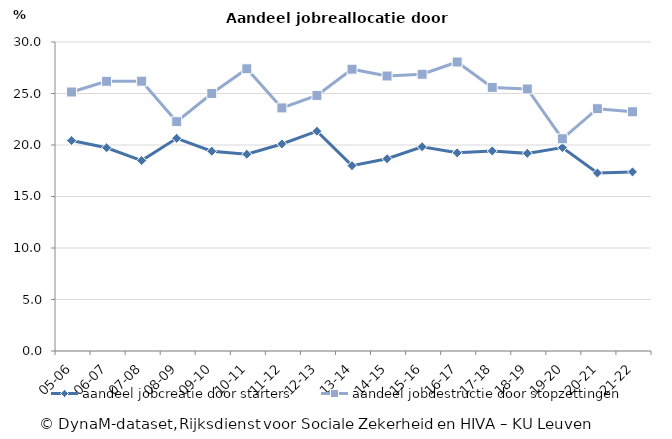
| Category | aandeel jobcreatie door starters | aandeel jobdestructie door stopzettingen |
|---|---|---|
| 21-22 | 17.386 | 23.225 |
| 20-21 | 17.282 | 23.523 |
| 19-20 | 19.747 | 20.603 |
| 18-19 | 19.188 | 25.437 |
| 17-18 | 19.421 | 25.59 |
| 16-17 | 19.239 | 28.058 |
| 15-16 | 19.834 | 26.869 |
| 14-15 | 18.664 | 26.698 |
| 13-14 | 17.995 | 27.358 |
| 12-13 | 21.339 | 24.815 |
| 11-12 | 20.1 | 23.6 |
| 10-11 | 19.1 | 27.4 |
| 09-10 | 19.393 | 25.003 |
| 08-09 | 20.646 | 22.265 |
| 07-08 | 18.491 | 26.195 |
| 06-07 | 19.734 | 26.186 |
| 05-06 | 20.428 | 25.145 |